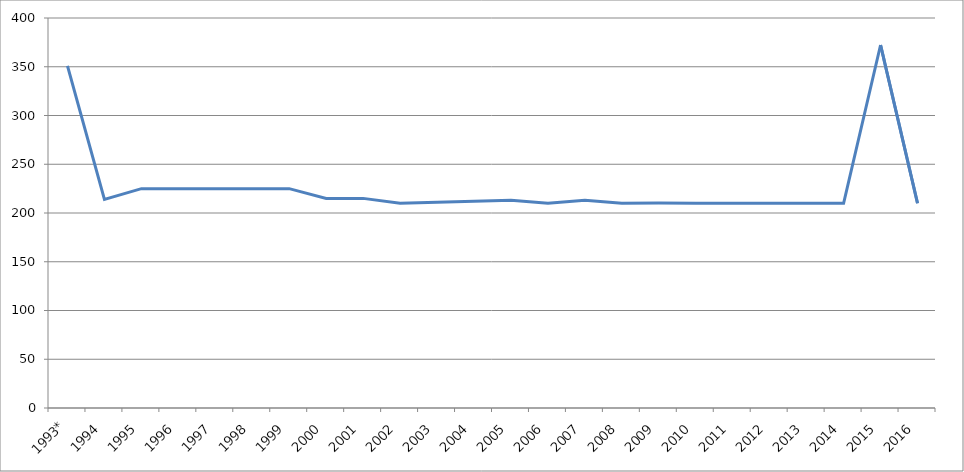
| Category | Series 0 |
|---|---|
| 1993* | 351 |
| 1994 | 214 |
| 1995 | 225 |
| 1996 | 225 |
| 1997 | 225 |
| 1998 | 225 |
| 1999 | 225 |
| 2000 | 215 |
| 2001 | 215 |
| 2002 | 210 |
| 2003 | 211 |
| 2004 | 212 |
| 2005 | 213 |
| 2006 | 210 |
| 2007 | 213 |
| 2008 | 210 |
| 2009 | 210.3 |
| 2010 | 210 |
| 2011 | 210 |
| 2012 | 210 |
| 2013 | 210 |
| 2014 | 210 |
| 2015 | 372.3 |
| 2016 | 210 |